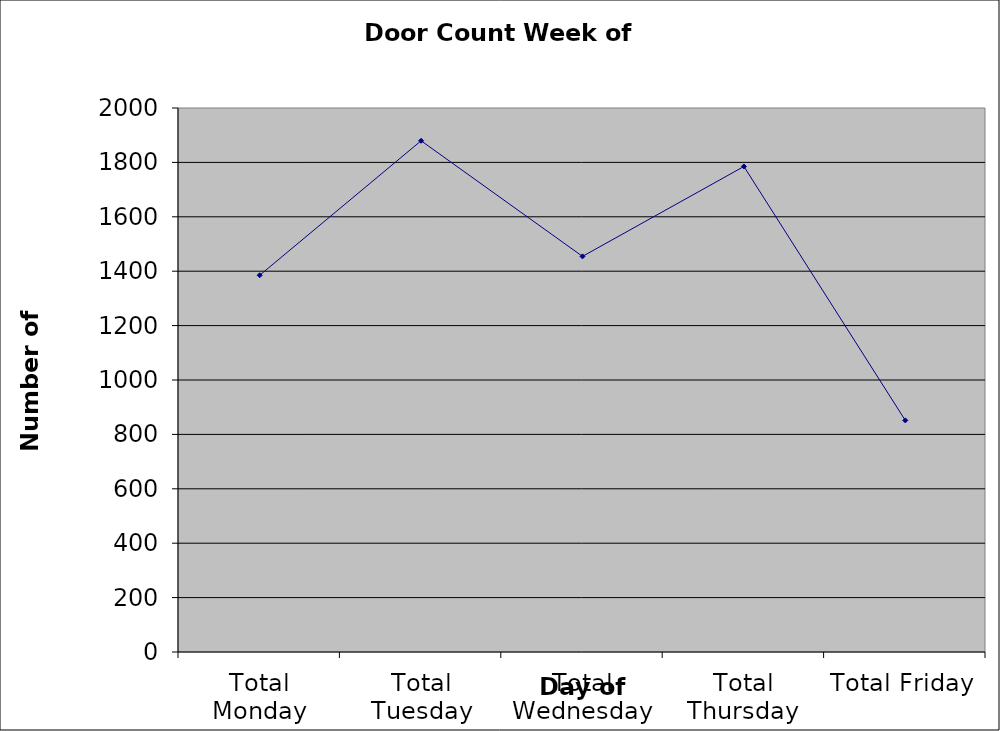
| Category | Series 0 |
|---|---|
| Total Monday | 1385 |
| Total Tuesday | 1879.5 |
| Total Wednesday | 1454.5 |
| Total Thursday | 1785 |
| Total Friday | 851.5 |